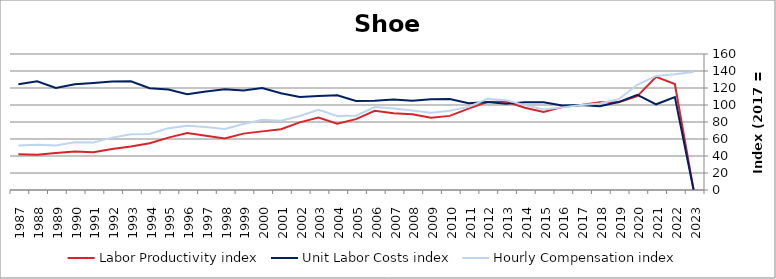
| Category | Labor Productivity index | Unit Labor Costs index | Hourly Compensation index |
|---|---|---|---|
| 2023.0 | 0 | 0 | 138.868 |
| 2022.0 | 124.678 | 109.302 | 136.275 |
| 2021.0 | 133.07 | 100.843 | 134.192 |
| 2020.0 | 110.491 | 112.033 | 123.786 |
| 2019.0 | 103.172 | 103.43 | 106.711 |
| 2018.0 | 103.225 | 98.589 | 101.768 |
| 2017.0 | 100 | 100 | 100 |
| 2016.0 | 97.638 | 99.559 | 97.207 |
| 2015.0 | 91.68 | 103.25 | 94.66 |
| 2014.0 | 96.843 | 103.111 | 99.856 |
| 2013.0 | 104.065 | 101.34 | 105.46 |
| 2012.0 | 103.552 | 103.537 | 107.215 |
| 2011.0 | 95.685 | 102.195 | 97.785 |
| 2010.0 | 87.193 | 106.953 | 93.256 |
| 2009.0 | 85.107 | 106.818 | 90.909 |
| 2008.0 | 89.121 | 105.08 | 93.649 |
| 2007.0 | 90.175 | 106.337 | 95.89 |
| 2006.0 | 93.088 | 104.878 | 97.629 |
| 2005.0 | 83.396 | 104.717 | 87.33 |
| 2004.0 | 78.089 | 111.403 | 86.994 |
| 2003.0 | 85.153 | 110.668 | 94.237 |
| 2002.0 | 79.583 | 109.435 | 87.093 |
| 2001.0 | 71.508 | 113.855 | 81.415 |
| 2000.0 | 68.976 | 119.979 | 82.757 |
| 1999.0 | 66.329 | 116.969 | 77.585 |
| 1998.0 | 60.733 | 118.401 | 71.909 |
| 1997.0 | 63.906 | 115.889 | 74.06 |
| 1996.0 | 67.036 | 112.693 | 75.545 |
| 1995.0 | 61.589 | 118.141 | 72.761 |
| 1994.0 | 55.054 | 119.684 | 65.891 |
| 1993.0 | 51.201 | 127.83 | 65.45 |
| 1992.0 | 48.326 | 127.515 | 61.622 |
| 1991.0 | 44.313 | 125.916 | 55.797 |
| 1990.0 | 45.206 | 124.378 | 56.226 |
| 1989.0 | 43.671 | 120.065 | 52.433 |
| 1988.0 | 41.562 | 127.944 | 53.176 |
| 1987.0 | 42.072 | 124.304 | 52.297 |